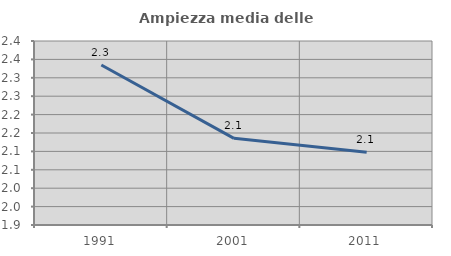
| Category | Ampiezza media delle famiglie |
|---|---|
| 1991.0 | 2.335 |
| 2001.0 | 2.135 |
| 2011.0 | 2.098 |